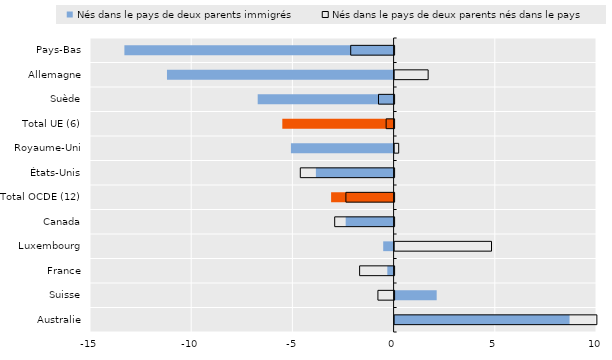
| Category | Nés dans le pays de deux parents immigrés | Nés dans le pays de deux parents nés dans le pays |
|---|---|---|
| Pays-Bas | -13.3 | -2.144 |
| Allemagne | -11.197 | 1.658 |
| Suède | -6.714 | -0.771 |
| Total UE (6) | -5.499 | -0.393 |
| Royaume-Uni | -5.072 | 0.202 |
| États-Unis | -3.84 | -4.634 |
| Total OCDE (12) | -3.088 | -2.382 |
| Canada | -2.368 | -2.935 |
| Luxembourg | -0.514 | 4.788 |
| France | -0.31 | -1.704 |
| Suisse | 2.079 | -0.799 |
| Australie | 8.644 | 9.994 |